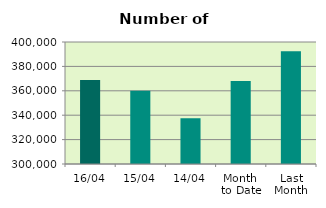
| Category | Series 0 |
|---|---|
| 16/04 | 368820 |
| 15/04 | 360004 |
| 14/04 | 337564 |
| Month 
to Date | 367997.333 |
| Last
Month | 392496.174 |